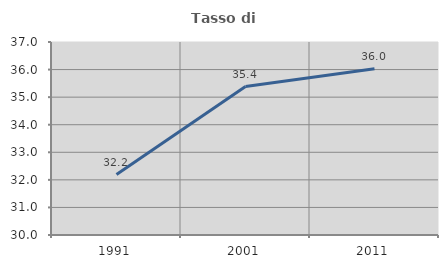
| Category | Tasso di occupazione   |
|---|---|
| 1991.0 | 32.19 |
| 2001.0 | 35.386 |
| 2011.0 | 36.029 |